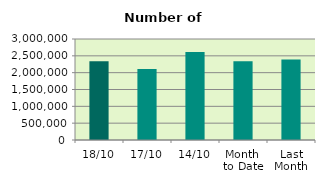
| Category | Series 0 |
|---|---|
| 18/10 | 2339540 |
| 17/10 | 2108278 |
| 14/10 | 2614614 |
| Month 
to Date | 2340601 |
| Last
Month | 2392468.182 |